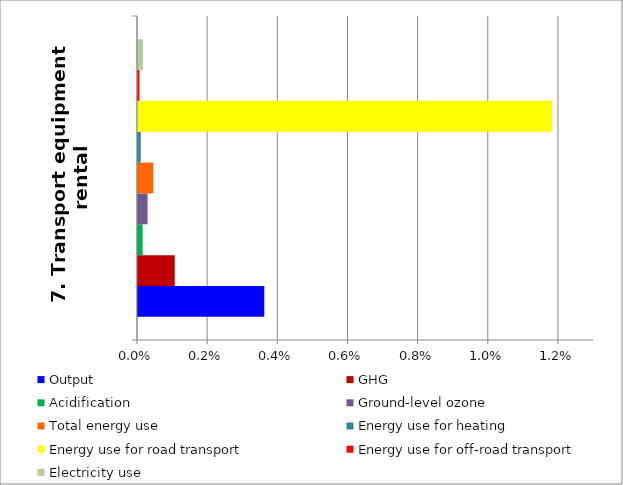
| Category | Output | GHG | Acidification | Ground-level ozone | Total energy use | Energy use for heating | Energy use for road transport | Energy use for off-road transport | Electricity use |
|---|---|---|---|---|---|---|---|---|---|
| 7. Transport equipment rental | 0.004 | 0.001 | 0 | 0 | 0 | 0 | 0.012 | 0 | 0 |